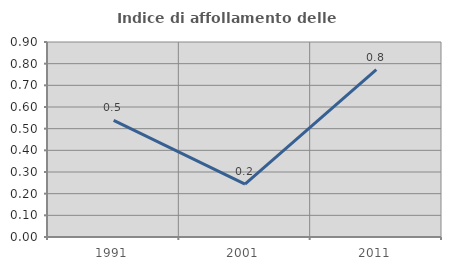
| Category | Indice di affollamento delle abitazioni  |
|---|---|
| 1991.0 | 0.538 |
| 2001.0 | 0.244 |
| 2011.0 | 0.772 |